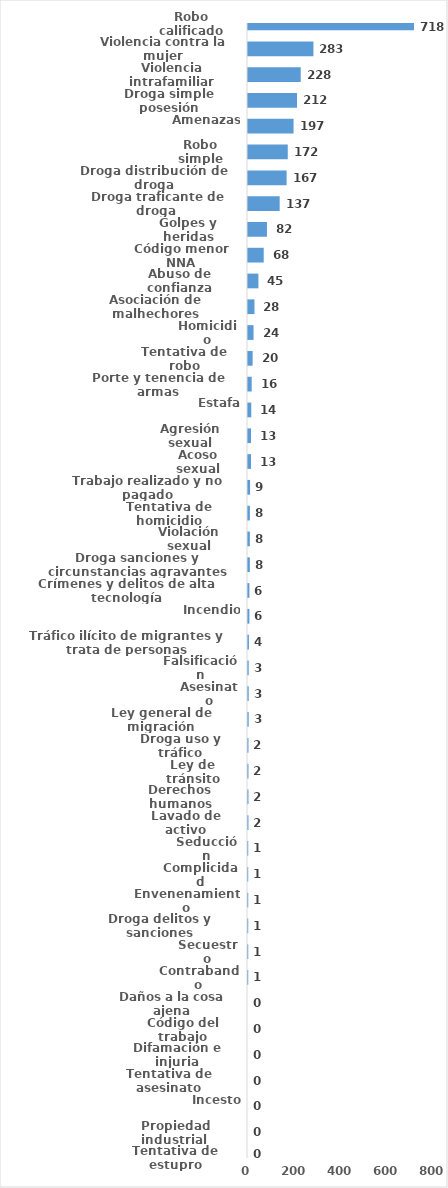
| Category | Series 0 |
|---|---|
| Robo calificado | 718 |
| Violencia contra la mujer | 283 |
| Violencia intrafamiliar | 228 |
| Droga simple posesión | 212 |
| Amenazas | 197 |
| Robo simple | 172 |
| Droga distribución de droga | 167 |
| Droga traficante de droga  | 137 |
| Golpes y heridas | 82 |
| Código menor NNA | 68 |
| Abuso de confianza | 45 |
| Asociación de malhechores | 28 |
| Homicidio | 24 |
| Tentativa de robo | 20 |
| Porte y tenencia de armas | 16 |
| Estafa | 14 |
| Agresión sexual | 13 |
| Acoso sexual | 13 |
| Trabajo realizado y no pagado | 9 |
| Tentativa de homicidio | 8 |
| Violación sexual | 8 |
| Droga sanciones y circunstancias agravantes | 8 |
| Crímenes y delitos de alta tecnología | 6 |
| Incendio | 6 |
| Tráfico ilícito de migrantes y trata de personas | 4 |
| Falsificación | 3 |
| Asesinato | 3 |
| Ley general de migración | 3 |
| Droga uso y tráfico | 2 |
| Ley de tránsito | 2 |
| Derechos humanos | 2 |
| Lavado de activo | 2 |
| Seducción | 1 |
| Complicidad | 1 |
| Envenenamiento | 1 |
| Droga delitos y sanciones | 1 |
| Secuestro | 1 |
| Contrabando | 1 |
| Daños a la cosa ajena | 0 |
| Código del trabajo | 0 |
| Difamación e injuria | 0 |
| Tentativa de asesinato | 0 |
| Incesto | 0 |
| Propiedad industrial  | 0 |
| Tentativa de estupro | 0 |